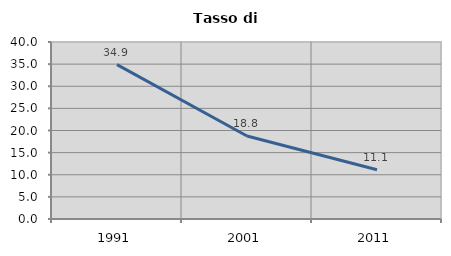
| Category | Tasso di disoccupazione   |
|---|---|
| 1991.0 | 34.889 |
| 2001.0 | 18.756 |
| 2011.0 | 11.12 |